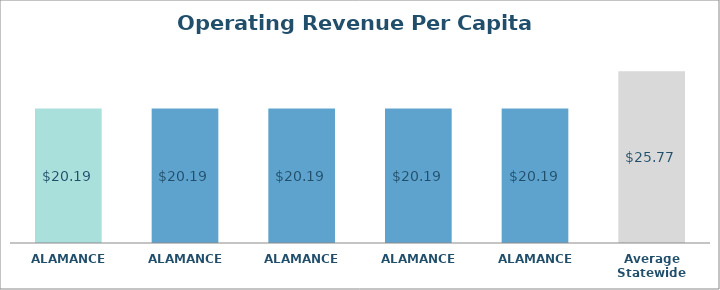
| Category | Series 0 |
|---|---|
| ALAMANCE  | 20.192 |
| ALAMANCE  | 20.192 |
| ALAMANCE  | 20.192 |
| ALAMANCE  | 20.192 |
| ALAMANCE  | 20.192 |
| Average Statewide | 25.769 |